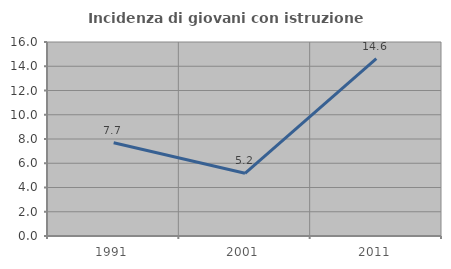
| Category | Incidenza di giovani con istruzione universitaria |
|---|---|
| 1991.0 | 7.692 |
| 2001.0 | 5.172 |
| 2011.0 | 14.634 |